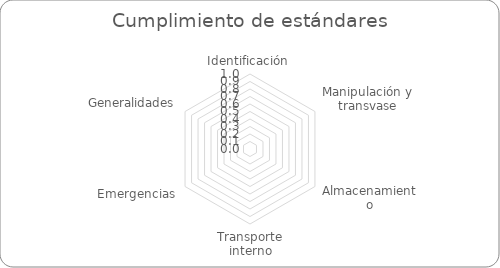
| Category | Series 0 | Series 1 |
|---|---|---|
| Identificación |  | 0 |
| Manipulación y transvase |  | 0 |
| Almacenamiento |  | 0 |
| Transporte interno |  | 0 |
| Emergencias |  | 0 |
| Generalidades |  | 0 |